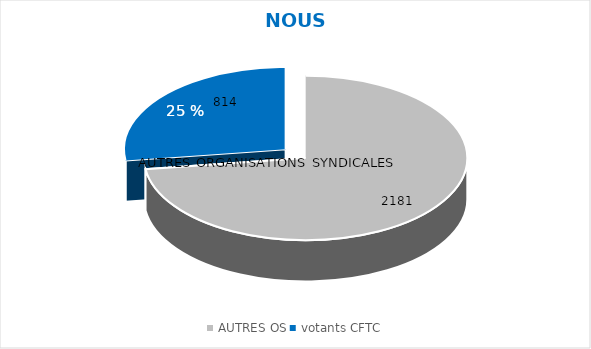
| Category | Series 0 |
|---|---|
| AUTRES OS | 2181 |
| votants CFTC | 814 |